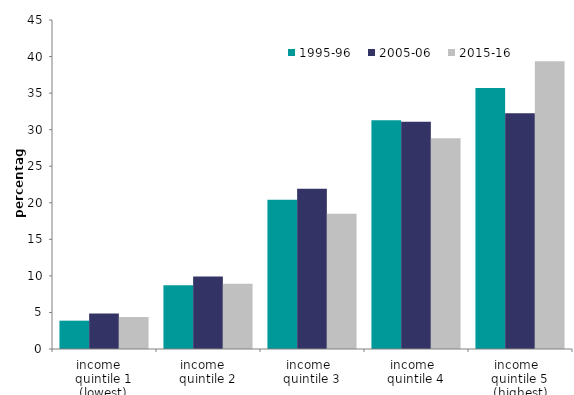
| Category | 1995-96 | 2005-06 | 2015-16 |
|---|---|---|---|
| income   
quintile 1 (lowest) | 3.875 | 4.844 | 4.377 |
| income   
quintile 2 | 8.713 | 9.922 | 8.929 |
| income  
quintile 3 | 20.42 | 21.913 | 18.503 |
| income  
quintile 4 | 31.282 | 31.078 | 28.823 |
| income  
quintile 5 (highest) | 35.71 | 32.244 | 39.368 |